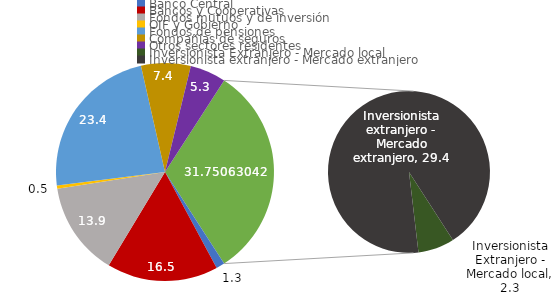
| Category | Series 0 |
|---|---|
| Banco Central | 1.268 |
| Bancos y Cooperativas | 16.486 |
| Fondos mutuos y de inversión | 13.9 |
| OIF y Gobierno | 0.499 |
| Fondos de pensiones | 23.429 |
| Compañias de seguros | 7.356 |
| Otros sectores residentes | 5.312 |
| Inversionista Extranjero - Mercado local | 2.303 |
| Inversionista extranjero - Mercado extranjero | 29.448 |